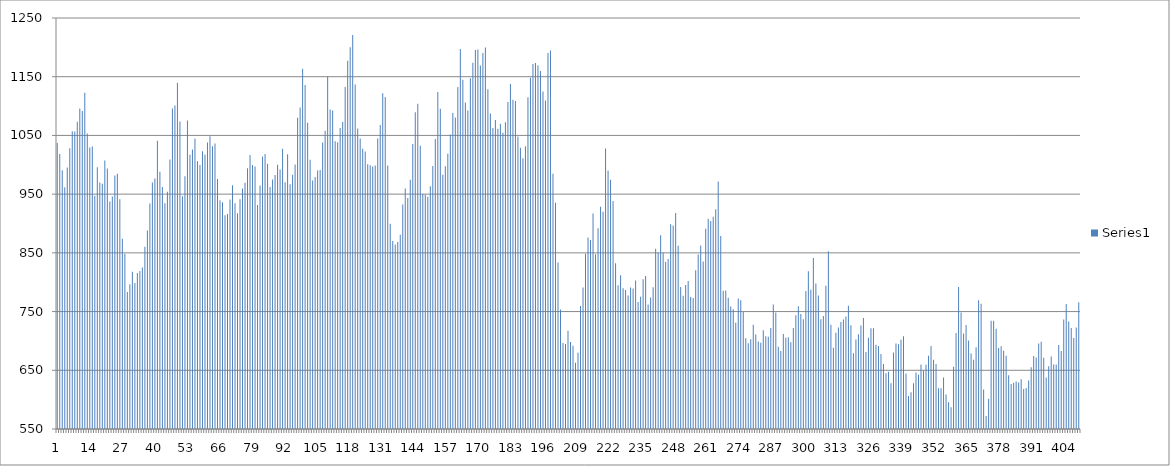
| Category | Series 0 |
|---|---|
| 0 | 1036.97 |
| 1 | 1018.41 |
| 2 | 990.59 |
| 3 | 961.88 |
| 4 | 995.555 |
| 5 | 1028.09 |
| 6 | 1056.98 |
| 7 | 1056.735 |
| 8 | 1073.085 |
| 9 | 1096.03 |
| 10 | 1091.495 |
| 11 | 1122.7 |
| 12 | 1053.235 |
| 13 | 1029.525 |
| 14 | 1031.32 |
| 15 | 947.08 |
| 16 | 995.985 |
| 17 | 969.765 |
| 18 | 967.505 |
| 19 | 1007.43 |
| 20 | 993.735 |
| 21 | 937.345 |
| 22 | 946.145 |
| 23 | 981.555 |
| 24 | 984.56 |
| 25 | 941.325 |
| 26 | 874.155 |
| 27 | 848.305 |
| 28 | 783.13 |
| 29 | 796.685 |
| 30 | 817.78 |
| 31 | 798.485 |
| 32 | 815.485 |
| 33 | 819.06 |
| 34 | 825.2 |
| 35 | 860.28 |
| 36 | 888.005 |
| 37 | 934.195 |
| 38 | 969.68 |
| 39 | 976.69 |
| 40 | 1040.735 |
| 41 | 988.145 |
| 42 | 961.99 |
| 43 | 934.68 |
| 44 | 954.095 |
| 45 | 1009.145 |
| 46 | 1095.8 |
| 47 | 1100.86 |
| 48 | 1139.92 |
| 49 | 1073.91 |
| 50 | 946.2 |
| 51 | 980.415 |
| 52 | 1075.635 |
| 53 | 1017.295 |
| 54 | 1026.175 |
| 55 | 1044.835 |
| 56 | 1006.07 |
| 57 | 999.645 |
| 58 | 1023.185 |
| 59 | 1017.705 |
| 60 | 1037.96 |
| 61 | 1048.445 |
| 62 | 1031.735 |
| 63 | 1036.29 |
| 64 | 975.815 |
| 65 | 939.775 |
| 66 | 936.135 |
| 67 | 914.115 |
| 68 | 916.38 |
| 69 | 941.035 |
| 70 | 964.97 |
| 71 | 934.53 |
| 72 | 917.47 |
| 73 | 941.29 |
| 74 | 959.64 |
| 75 | 969.495 |
| 76 | 994.265 |
| 77 | 1016.65 |
| 78 | 999.495 |
| 79 | 997.01 |
| 80 | 931.36 |
| 81 | 964.85 |
| 82 | 1013.985 |
| 83 | 1018.515 |
| 84 | 1001.605 |
| 85 | 962.115 |
| 86 | 975.045 |
| 87 | 982.555 |
| 88 | 999.925 |
| 89 | 991.79 |
| 90 | 1027.35 |
| 91 | 970.28 |
| 92 | 1018.145 |
| 93 | 966.715 |
| 94 | 982.95 |
| 95 | 1000.47 |
| 96 | 1080.21 |
| 97 | 1097.59 |
| 98 | 1163.41 |
| 99 | 1135.875 |
| 100 | 1071.485 |
| 101 | 1008.535 |
| 102 | 973.425 |
| 103 | 979.325 |
| 104 | 990.325 |
| 105 | 991.24 |
| 106 | 1038.05 |
| 107 | 1058.025 |
| 108 | 1150.815 |
| 109 | 1094.07 |
| 110 | 1092.46 |
| 111 | 1040.04 |
| 112 | 1038.505 |
| 113 | 1062.635 |
| 114 | 1072.98 |
| 115 | 1132.56 |
| 116 | 1177.2 |
| 117 | 1200.19 |
| 118 | 1220.98 |
| 119 | 1136.645 |
| 120 | 1061.955 |
| 121 | 1044.845 |
| 122 | 1027.345 |
| 123 | 1022.54 |
| 124 | 1000.865 |
| 125 | 999.265 |
| 126 | 996.99 |
| 127 | 998.73 |
| 128 | 1044.88 |
| 129 | 1067.83 |
| 130 | 1121.73 |
| 131 | 1115.245 |
| 132 | 998.915 |
| 133 | 899.545 |
| 134 | 870.355 |
| 135 | 864.3 |
| 136 | 868.425 |
| 137 | 880.795 |
| 138 | 932.53 |
| 139 | 959.61 |
| 140 | 943.37 |
| 141 | 974.475 |
| 142 | 1035.505 |
| 143 | 1089.625 |
| 144 | 1104.11 |
| 145 | 1032.235 |
| 146 | 950.12 |
| 147 | 948.84 |
| 148 | 945.62 |
| 149 | 963.38 |
| 150 | 997.96 |
| 151 | 1043.92 |
| 152 | 1123.915 |
| 153 | 1095.565 |
| 154 | 983.05 |
| 155 | 997.335 |
| 156 | 1018.94 |
| 157 | 1051.78 |
| 158 | 1088.025 |
| 159 | 1080.725 |
| 160 | 1132.565 |
| 161 | 1197.33 |
| 162 | 1145.035 |
| 163 | 1106.12 |
| 164 | 1092.465 |
| 165 | 1147.325 |
| 166 | 1173.675 |
| 167 | 1195.295 |
| 168 | 1196.45 |
| 169 | 1169.195 |
| 170 | 1190.43 |
| 171 | 1199.85 |
| 172 | 1128.44 |
| 173 | 1087.165 |
| 174 | 1062.57 |
| 175 | 1076.085 |
| 176 | 1061.33 |
| 177 | 1069.84 |
| 178 | 1054.58 |
| 179 | 1072.645 |
| 180 | 1106.92 |
| 181 | 1137.545 |
| 182 | 1110.61 |
| 183 | 1108.535 |
| 184 | 1048.015 |
| 185 | 1029.035 |
| 186 | 1011.29 |
| 187 | 1031.51 |
| 188 | 1115.23 |
| 189 | 1148.4 |
| 190 | 1171.62 |
| 191 | 1173.195 |
| 192 | 1169.29 |
| 193 | 1159.665 |
| 194 | 1124.68 |
| 195 | 1109.29 |
| 196 | 1190.385 |
| 197 | 1194.85 |
| 198 | 984.545 |
| 199 | 935.3 |
| 200 | 833.41 |
| 201 | 753.5 |
| 202 | 696.28 |
| 203 | 694.87 |
| 204 | 717.385 |
| 205 | 698.035 |
| 206 | 691.745 |
| 207 | 662.865 |
| 208 | 679.935 |
| 209 | 759.45 |
| 210 | 790.925 |
| 211 | 848.35 |
| 212 | 876.2 |
| 213 | 871.93 |
| 214 | 917.22 |
| 215 | 847.565 |
| 216 | 891.835 |
| 217 | 928.725 |
| 218 | 920.1 |
| 219 | 1027.635 |
| 220 | 990.345 |
| 221 | 974.485 |
| 222 | 938.155 |
| 223 | 832.245 |
| 224 | 794.955 |
| 225 | 811.985 |
| 226 | 789.54 |
| 227 | 786.54 |
| 228 | 777.42 |
| 229 | 791.015 |
| 230 | 789.225 |
| 231 | 802.75 |
| 232 | 766.335 |
| 233 | 775.055 |
| 234 | 804.86 |
| 235 | 810.46 |
| 236 | 761.86 |
| 237 | 774.105 |
| 238 | 791.34 |
| 239 | 856.99 |
| 240 | 850.285 |
| 241 | 880.025 |
| 242 | 850.165 |
| 243 | 834.48 |
| 244 | 839.4 |
| 245 | 898.93 |
| 246 | 896.44 |
| 247 | 917.72 |
| 248 | 861.96 |
| 249 | 791.745 |
| 250 | 777.125 |
| 251 | 795.46 |
| 252 | 802.185 |
| 253 | 774.935 |
| 254 | 772.965 |
| 255 | 820.33 |
| 256 | 847.1 |
| 257 | 862.35 |
| 258 | 835.365 |
| 259 | 891.25 |
| 260 | 908.03 |
| 261 | 904.15 |
| 262 | 911.56 |
| 263 | 924.205 |
| 264 | 971.34 |
| 265 | 878.515 |
| 266 | 785.595 |
| 267 | 786.08 |
| 268 | 773.495 |
| 269 | 758.815 |
| 270 | 754.07 |
| 271 | 730.98 |
| 272 | 772.455 |
| 273 | 769.125 |
| 274 | 749.235 |
| 275 | 704.685 |
| 276 | 695.935 |
| 277 | 702.7 |
| 278 | 727.685 |
| 279 | 710.815 |
| 280 | 698.815 |
| 281 | 697.015 |
| 282 | 718.32 |
| 283 | 707.905 |
| 284 | 706.97 |
| 285 | 721.85 |
| 286 | 762.02 |
| 287 | 748.21 |
| 288 | 690.015 |
| 289 | 682.86 |
| 290 | 711.92 |
| 291 | 705.595 |
| 292 | 706.23 |
| 293 | 697.605 |
| 294 | 722.21 |
| 295 | 743.685 |
| 296 | 758.895 |
| 297 | 745.68 |
| 298 | 736.895 |
| 299 | 784.84 |
| 300 | 818.725 |
| 301 | 786.955 |
| 302 | 841.415 |
| 303 | 797.855 |
| 304 | 777.28 |
| 305 | 736.85 |
| 306 | 742.63 |
| 307 | 794.065 |
| 308 | 852.885 |
| 309 | 727.69 |
| 310 | 688.46 |
| 311 | 713.76 |
| 312 | 722.67 |
| 313 | 732.28 |
| 314 | 736.505 |
| 315 | 741.47 |
| 316 | 759.89 |
| 317 | 726.78 |
| 318 | 678.875 |
| 319 | 702.315 |
| 320 | 711.295 |
| 321 | 726.235 |
| 322 | 738.92 |
| 323 | 681.335 |
| 324 | 705.465 |
| 325 | 721.57 |
| 326 | 721.785 |
| 327 | 693.57 |
| 328 | 691.5 |
| 329 | 677.65 |
| 330 | 660.535 |
| 331 | 645 |
| 332 | 647.62 |
| 333 | 628.115 |
| 334 | 680.275 |
| 335 | 695.425 |
| 336 | 694.375 |
| 337 | 702.185 |
| 338 | 708.115 |
| 339 | 644.535 |
| 340 | 606.29 |
| 341 | 612.79 |
| 342 | 627.775 |
| 343 | 646.39 |
| 344 | 642.335 |
| 345 | 659.95 |
| 346 | 649.805 |
| 347 | 659.314 |
| 348 | 674.61 |
| 349 | 691.315 |
| 350 | 668.005 |
| 351 | 660.66 |
| 352 | 619.53 |
| 353 | 619.5 |
| 354 | 637.515 |
| 355 | 608.86 |
| 356 | 595.41 |
| 357 | 586.975 |
| 358 | 656.05 |
| 359 | 713.495 |
| 360 | 791.855 |
| 361 | 748.46 |
| 362 | 712.69 |
| 363 | 727.225 |
| 364 | 700.695 |
| 365 | 678.7 |
| 366 | 668.095 |
| 367 | 689.355 |
| 368 | 769.265 |
| 369 | 763.165 |
| 370 | 617.455 |
| 371 | 572.105 |
| 372 | 601.41 |
| 373 | 734.315 |
| 374 | 734.49 |
| 375 | 720.69 |
| 376 | 688.155 |
| 377 | 691.075 |
| 378 | 683.4 |
| 379 | 674.965 |
| 380 | 641.395 |
| 381 | 626.46 |
| 382 | 628.745 |
| 383 | 631.03 |
| 384 | 629.235 |
| 385 | 634.855 |
| 386 | 618.2 |
| 387 | 619.9 |
| 388 | 632.745 |
| 389 | 655.365 |
| 390 | 674.13 |
| 391 | 671.665 |
| 392 | 695.72 |
| 393 | 698.765 |
| 394 | 671.405 |
| 395 | 637.745 |
| 396 | 657.04 |
| 397 | 673.625 |
| 398 | 659.96 |
| 399 | 659.78 |
| 400 | 693.085 |
| 401 | 682.72 |
| 402 | 736.665 |
| 403 | 762.72 |
| 404 | 732.92 |
| 405 | 721.91 |
| 406 | 705.13 |
| 407 | 722.67 |
| 408 | 765.77 |